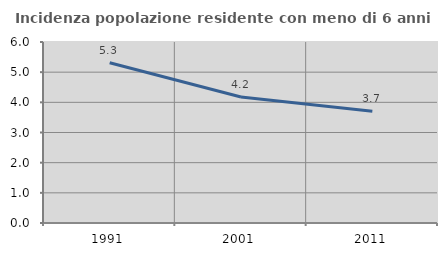
| Category | Incidenza popolazione residente con meno di 6 anni |
|---|---|
| 1991.0 | 5.313 |
| 2001.0 | 4.175 |
| 2011.0 | 3.705 |